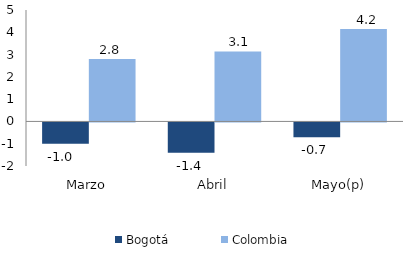
| Category | Bogotá | Colombia |
|---|---|---|
| Marzo | -0.956 | 2.803 |
| Abril | -1.359 | 3.142 |
| Mayo(p) | -0.665 | 4.152 |